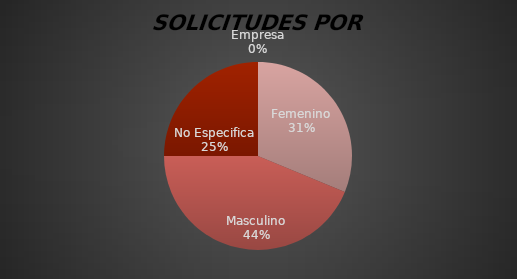
| Category | Series 0 |
|---|---|
| Femenino | 15 |
| Masculino | 21 |
| No Especifica | 12 |
| Empresa | 0 |